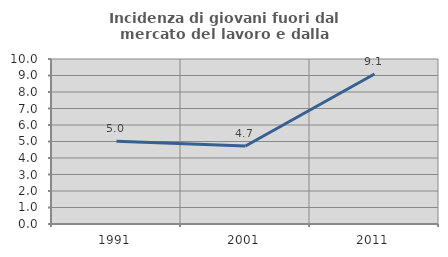
| Category | Incidenza di giovani fuori dal mercato del lavoro e dalla formazione  |
|---|---|
| 1991.0 | 5.013 |
| 2001.0 | 4.73 |
| 2011.0 | 9.091 |